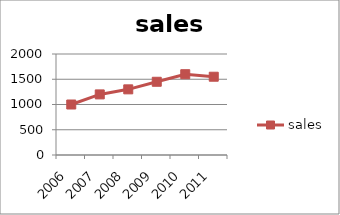
| Category | sales |
|---|---|
| 2006.0 | 1000 |
| 2007.0 | 1200 |
| 2008.0 | 1300 |
| 2009.0 | 1450 |
| 2010.0 | 1600 |
| 2011.0 | 1550 |